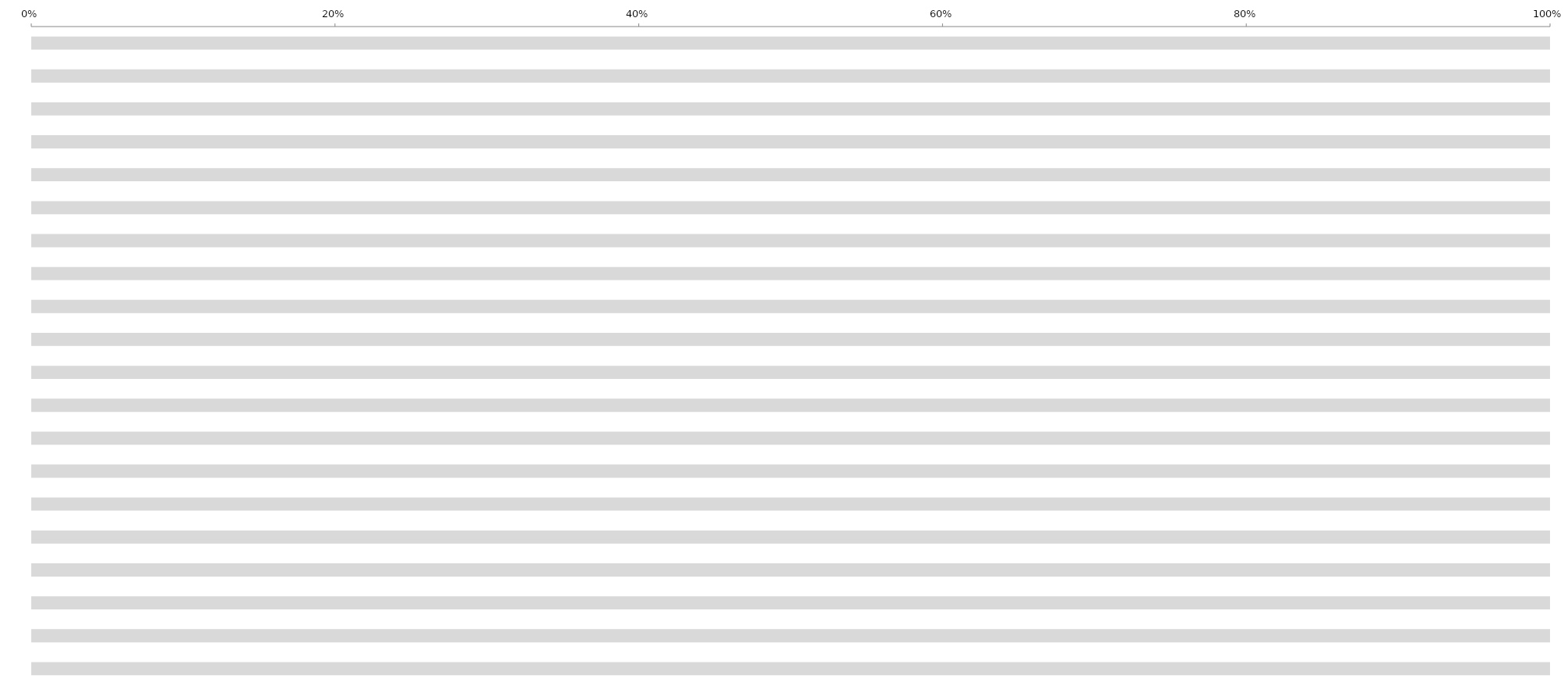
| Category | % Earned | % No | % Unanswered |
|---|---|---|---|
| PRODUCTION  | 0 | 0 | 1 |
| ACCOUNTING  | 0 | 0 | 1 |
| ART | 0 | 0 | 1 |
| ASSISTANT DIRECTORS | 0 | 0 | 1 |
| CAMERA | 0 | 0 | 1 |
| CATERING | 0 | 0 | 1 |
| LOCATION | 0 | 0 | 1 |
| COSTUME/WARDROBE | 0 | 0 | 1 |
| CRAFT SERVICE | 0 | 0 | 1 |
| ELECTRIC | 0 | 0 | 1 |
| GREEN | 0 | 0 | 1 |
| GRIP | 0 | 0 | 1 |
| HAIR | 0 | 0 | 1 |
| CONSTRUCTION | 0 | 0 | 1 |
| MAKE UP | 0 | 0 | 1 |
| PROP | 0 | 0 | 1 |
| SET DECORATION | 0 | 0 | 1 |
| SPECIAL EFFECTS | 0 | 0 | 1 |
| SOUND | 0 | 0 | 1 |
| TRANSPORTATION | 0 | 0 | 1 |